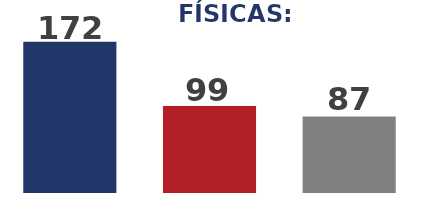
| Category | Series 0 |
|---|---|
| 0 | 172 |
| 1 | 99 |
| 2 | 87 |